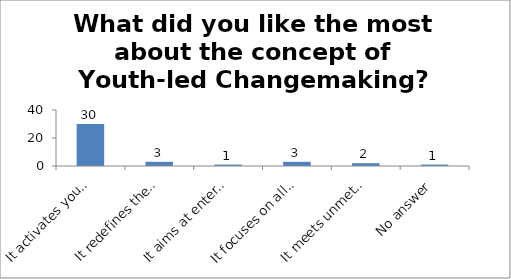
| Category | What did you like the most about the concept of Youth-led Changemaking? |
|---|---|
| It activates young people as Changemakers | 30 |
| It redefines the field of youth development | 3 |
| It aims at enterprising education | 1 |
| It focuses on all (troubled and prepared) young people | 3 |
| It meets unmet service needs of the society | 2 |
| No answer | 1 |